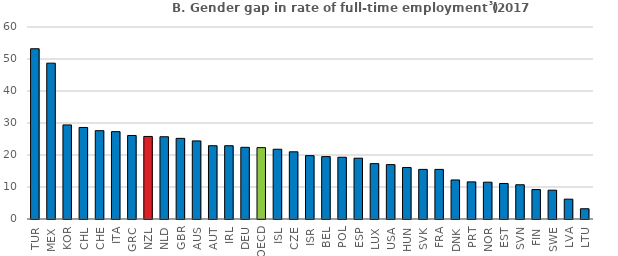
| Category | Gap |
|---|---|
| TUR | 53.2 |
| MEX | 48.7 |
| KOR | 29.4 |
| CHL | 28.6 |
| CHE | 27.6 |
| ITA | 27.3 |
| GRC | 26.1 |
| NZL | 25.8 |
| NLD | 25.7 |
| GBR | 25.2 |
| AUS | 24.4 |
| AUT | 22.9 |
| IRL | 22.9 |
| DEU | 22.4 |
| OECD | 22.3 |
| ISL | 21.8 |
| CZE | 21 |
| ISR | 19.8 |
| BEL | 19.5 |
| POL | 19.3 |
| ESP | 19 |
| LUX | 17.3 |
| USA | 17 |
| HUN | 16.1 |
| SVK | 15.5 |
| FRA | 15.5 |
| DNK | 12.2 |
| PRT | 11.6 |
| NOR | 11.5 |
| EST | 11.1 |
| SVN | 10.7 |
| FIN | 9.2 |
| SWE | 9 |
| LVA | 6.2 |
| LTU | 3.2 |